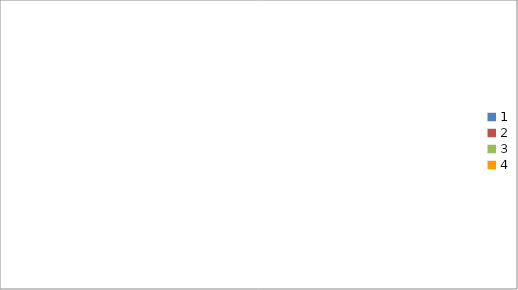
| Category | Series 0 |
|---|---|
| 0 | 1600 |
| 1 | 2090 |
| 2 | 850 |
| 3 | 1180 |